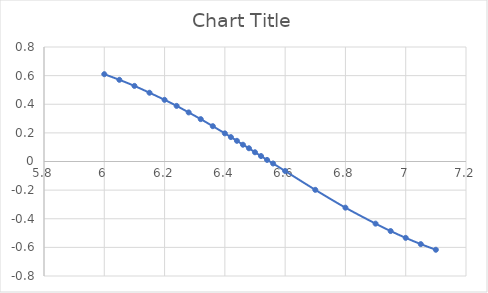
| Category | Series 0 |
|---|---|
| 6.0 | 0.61 |
| 6.05 | 0.571 |
| 6.1 | 0.528 |
| 6.15 | 0.48 |
| 6.2 | 0.431 |
| 6.24 | 0.388 |
| 6.28 | 0.343 |
| 6.32 | 0.296 |
| 6.36 | 0.247 |
| 6.4 | 0.196 |
| 6.42 | 0.171 |
| 6.44 | 0.144 |
| 6.46 | 0.117 |
| 6.48 | 0.092 |
| 6.5 | 0.064 |
| 6.52 | 0.038 |
| 6.54 | 0.011 |
| 6.56 | -0.014 |
| 6.6 | -0.066 |
| 6.7 | -0.198 |
| 6.8 | -0.322 |
| 6.9 | -0.434 |
| 6.95 | -0.486 |
| 7.0 | -0.534 |
| 7.05 | -0.577 |
| 7.1 | -0.617 |